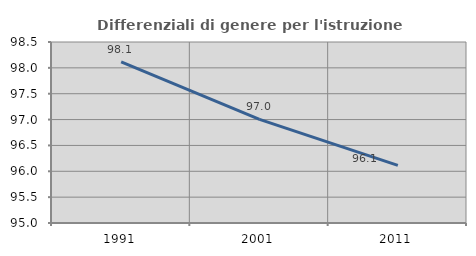
| Category | Differenziali di genere per l'istruzione superiore |
|---|---|
| 1991.0 | 98.116 |
| 2001.0 | 97.005 |
| 2011.0 | 96.114 |